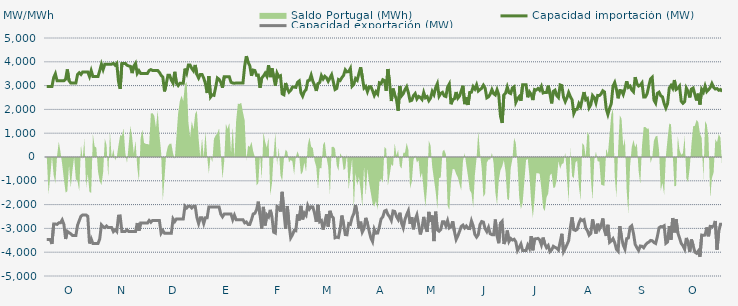
| Category | Capacidad importación (MW) | Capacidad exportación (MW) |
|---|---|---|
| 0 | 2966.667 | -3466.667 |
| 1900-01-01 | 2966.667 | -3466.667 |
| 1900-01-02 | 2966.667 | -3466.667 |
| 1900-01-03 | 2966.667 | -3654.167 |
| 1900-01-04 | 3335.417 | -2816.667 |
| 1900-01-05 | 3495.833 | -2816.667 |
| 1900-01-06 | 3204.167 | -2833.333 |
| 1900-01-07 | 3204.167 | -2766.667 |
| 1900-01-08 | 3204.167 | -2766.667 |
| 1900-01-09 | 3204.167 | -2641.667 |
| 1900-01-10 | 3204.167 | -2833.333 |
| 1900-01-11 | 3266.667 | -3443.75 |
| 1900-01-12 | 3679.167 | -3122.917 |
| 1900-01-13 | 3208.333 | -3179.167 |
| 1900-01-14 | 3108.333 | -3225 |
| 1900-01-15 | 3108.333 | -3300 |
| 1900-01-16 | 3108.333 | -3300 |
| 1900-01-17 | 3108.333 | -3300 |
| 1900-01-18 | 3466.667 | -2866.667 |
| 1900-01-19 | 3541.667 | -2672.5 |
| 1900-01-20 | 3466.667 | -2487.5 |
| 1900-01-21 | 3570.833 | -2433.333 |
| 1900-01-22 | 3570.833 | -2433.333 |
| 1900-01-23 | 3570.833 | -2433.333 |
| 1900-01-24 | 3570.833 | -2491.667 |
| 1900-01-25 | 3383.333 | -3633.333 |
| 1900-01-26 | 3632 | -3440 |
| 1900-01-27 | 3383.333 | -3633.333 |
| 1900-01-28 | 3383.333 | -3633.333 |
| 1900-01-29 | 3383.333 | -3633.333 |
| 1900-01-30 | 3383.333 | -3633.333 |
| 1900-01-31 | 3625 | -3445.833 |
| 1900-02-01 | 3900 | -2849.25 |
| 1900-02-02 | 3675 | -2929.167 |
| 1900-02-03 | 3900 | -2966.667 |
| 1900-02-04 | 3900 | -2900 |
| 1900-02-05 | 3900 | -2966.667 |
| 1900-02-06 | 3900 | -2966.667 |
| 1900-02-07 | 3900 | -2966.667 |
| 1900-02-08 | 3933.333 | -3133.333 |
| 1900-02-09 | 3858.333 | -3058.333 |
| 1900-02-10 | 3933.333 | -3133.333 |
| 1900-02-11 | 3175 | -2483.333 |
| 1900-02-12 | 2862.5 | -2475 |
| 1900-02-13 | 3933.333 | -3133.333 |
| 1900-02-14 | 3933.333 | -3133.333 |
| 1900-02-15 | 3933.333 | -3133.333 |
| 1900-02-16 | 3858.333 | -3058.333 |
| 1900-02-17 | 3825 | -3133.333 |
| 1900-02-18 | 3808.333 | -3133.333 |
| 1900-02-19 | 3525 | -3133.333 |
| 1900-02-20 | 3816.708 | -3133.333 |
| 1900-02-21 | 3933.333 | -3133.333 |
| 1900-02-22 | 3512.5 | -2775 |
| 1900-02-23 | 3627.083 | -3095.833 |
| 1900-02-24 | 3512.5 | -2775 |
| 1900-02-25 | 3512.5 | -2775 |
| 1900-02-26 | 3512.5 | -2775 |
| 1900-02-27 | 3512.5 | -2775 |
| 1900-02-28 | 3512.5 | -2775 |
| 1900-02-28 | 3633.333 | -2666.667 |
| 1900-03-01 | 3670.833 | -2741.667 |
| 1900-03-02 | 3633.333 | -2666.667 |
| 1900-03-03 | 3633.333 | -2666.667 |
| 1900-03-04 | 3633.333 | -2666.667 |
| 1900-03-05 | 3633.333 | -2666.667 |
| 1900-03-06 | 3557.083 | -2666.667 |
| 1900-03-07 | 3433.333 | -3200 |
| 1900-03-08 | 3358.333 | -3087.5 |
| 1900-03-09 | 2756.25 | -3200 |
| 1900-03-10 | 3066.667 | -3200 |
| 1900-03-11 | 3433.333 | -3200 |
| 1900-03-12 | 3433.333 | -3200 |
| 1900-03-13 | 3232.417 | -3200 |
| 1900-03-14 | 3100 | -2600 |
| 1900-03-15 | 3579.167 | -2712.5 |
| 1900-03-16 | 3100 | -2600 |
| 1900-03-17 | 3000.75 | -2600 |
| 1900-03-18 | 3100 | -2600 |
| 1900-03-19 | 3100 | -2600 |
| 1900-03-20 | 3100 | -2600 |
| 1900-03-21 | 3712.917 | -2066.667 |
| 1900-03-22 | 3527.083 | -2141.667 |
| 1900-03-23 | 3866.667 | -2066.667 |
| 1900-03-24 | 3866.667 | -2066.667 |
| 1900-03-25 | 3716.667 | -2141.667 |
| 1900-03-26 | 3616.667 | -2066.667 |
| 1900-03-27 | 3866.667 | -2066.667 |
| 1900-03-28 | 3466.667 | -2550 |
| 1900-03-29 | 3316.667 | -2795.833 |
| 1900-03-30 | 3466.667 | -2550 |
| 1900-03-31 | 3466.667 | -2550 |
| 1900-04-01 | 3316.667 | -2795.833 |
| 1900-04-02 | 3082.167 | -2550 |
| 1900-04-03 | 2687.5 | -2550 |
| 1900-04-04 | 3400 | -2100 |
| 1900-04-05 | 2520.833 | -2100 |
| 1900-04-06 | 2614.583 | -2100 |
| 1900-04-07 | 2591.25 | -2100 |
| 1900-04-08 | 2932.083 | -2100 |
| 1900-04-09 | 3318.75 | -2100 |
| 1900-04-10 | 3262.5 | -2100 |
| 1900-04-11 | 3139.583 | -2400 |
| 1900-04-12 | 2912.5 | -2512.5 |
| 1900-04-13 | 3366.667 | -2400 |
| 1900-04-14 | 3366.667 | -2400 |
| 1900-04-15 | 3366.667 | -2400 |
| 1900-04-16 | 3366.667 | -2400 |
| 1900-04-17 | 3139.583 | -2400 |
| 1900-04-18 | 3108.333 | -2633.333 |
| 1900-04-19 | 3100 | -2445.833 |
| 1900-04-20 | 3108.333 | -2633.333 |
| 1900-04-21 | 3108.333 | -2633.333 |
| 1900-04-22 | 3108.333 | -2633.333 |
| 1900-04-23 | 3108.333 | -2633.333 |
| 1900-04-24 | 3108.333 | -2633.333 |
| 1900-04-25 | 3822.917 | -2766.667 |
| 1900-04-26 | 4239.583 | -2729.167 |
| 1900-04-27 | 3979.167 | -2833.333 |
| 1900-04-28 | 3841.667 | -2833.333 |
| 1900-04-29 | 3414.375 | -2634.375 |
| 1900-04-30 | 3652.5 | -2392.5 |
| 1900-05-01 | 3633.75 | -2364.375 |
| 1900-05-02 | 3431.25 | -2212.5 |
| 1900-05-03 | 3442.5 | -1876.875 |
| 1900-05-04 | 2908.125 | -2420.625 |
| 1900-05-05 | 3318.75 | -3009.375 |
| 1900-05-06 | 3401.25 | -2096.25 |
| 1900-05-07 | 3519.375 | -2876.25 |
| 1900-05-08 | 3392.5 | -2430 |
| 1900-05-09 | 3856.875 | -2512.5 |
| 1900-05-10 | 3356.25 | -2221.875 |
| 1900-05-11 | 3727.5 | -2516.25 |
| 1900-05-12 | 3372.5 | -3157.5 |
| 1900-05-13 | 3000.208 | -3195 |
| 1900-05-14 | 3522.083 | -2079.375 |
| 1900-05-15 | 3371.667 | -2122.5 |
| 1900-05-16 | 3412.5 | -2291.25 |
| 1900-05-17 | 2653.125 | -1464.375 |
| 1900-05-18 | 2615 | -2298.75 |
| 1900-05-19 | 3110.625 | -3018.75 |
| 1900-05-20 | 2861.792 | -2062.5 |
| 1900-05-21 | 2726.042 | -2823.75 |
| 1900-05-22 | 2799.583 | -3397.5 |
| 1900-05-23 | 2936.25 | -3273.75 |
| 1900-05-24 | 2938.125 | -3091.875 |
| 1900-05-25 | 2925 | -3101.25 |
| 1900-05-26 | 3136.875 | -2413.125 |
| 1900-05-27 | 3195.208 | -2666.25 |
| 1900-05-28 | 2702.083 | -2053.125 |
| 1900-05-29 | 2556.042 | -2621.25 |
| 1900-05-30 | 2748.75 | -2355 |
| 1900-05-31 | 2825.625 | -2448.75 |
| 1900-06-01 | 3204.375 | -2034.375 |
| 1900-06-02 | 3223.333 | -2188.125 |
| 1900-06-03 | 3440.625 | -2092.5 |
| 1900-06-04 | 3180 | -2100 |
| 1900-06-05 | 3016.875 | -2368.125 |
| 1900-06-06 | 2777.292 | -2722.5 |
| 1900-06-07 | 3084.375 | -2008.125 |
| 1900-06-08 | 3130.833 | -2720.625 |
| 1900-06-09 | 3418.75 | -2671.875 |
| 1900-06-10 | 3277.917 | -3046.875 |
| 1900-06-11 | 3390.833 | -2735.625 |
| 1900-06-12 | 3326.25 | -2407.5 |
| 1900-06-13 | 3180 | -2921.25 |
| 1900-06-14 | 3320.625 | -2262.708 |
| 1900-06-15 | 3457.5 | -2488.125 |
| 1900-06-16 | 3158.75 | -2557.5 |
| 1900-06-17 | 2836.25 | -3393.75 |
| 1900-06-18 | 2879.167 | -3365.625 |
| 1900-06-19 | 3254.167 | -3384.375 |
| 1900-06-20 | 3214.167 | -3018.75 |
| 1900-06-21 | 3335.625 | -2460 |
| 1900-06-22 | 3429.375 | -2818.125 |
| 1900-06-23 | 3663.75 | -3258.75 |
| 1900-06-24 | 3577.583 | -3268.125 |
| 1900-06-25 | 3586.875 | -2801.25 |
| 1900-06-26 | 3721.875 | -2831.25 |
| 1900-06-27 | 2977.5 | -2542.5 |
| 1900-06-28 | 3058.043 | -2379.13 |
| 1900-06-29 | 3294.375 | -2013.75 |
| 1900-06-30 | 3223.125 | -2388.75 |
| 1900-07-01 | 3506.25 | -3005.625 |
| 1900-07-02 | 3770.625 | -2718.75 |
| 1900-07-03 | 3346.875 | -3153.75 |
| 1900-07-04 | 2898.75 | -3009.375 |
| 1900-07-05 | 2966.25 | -2556.708 |
| 1900-07-06 | 2745.417 | -2786.25 |
| 1900-07-07 | 2951.25 | -3112.083 |
| 1900-07-08 | 2955 | -3401.25 |
| 1900-07-09 | 2788.125 | -3553.125 |
| 1900-07-10 | 2587.5 | -3033.75 |
| 1900-07-11 | 2745 | -3200.625 |
| 1900-07-12 | 2645.625 | -3195 |
| 1900-07-13 | 3116.25 | -2932.5 |
| 1900-07-14 | 3084.375 | -2598.75 |
| 1900-07-15 | 3247.5 | -2520 |
| 1900-07-16 | 3208.125 | -2272.5 |
| 1900-07-17 | 2782.708 | -2238.75 |
| 1900-07-18 | 3697.5 | -2418.75 |
| 1900-07-19 | 3103.125 | -2514.375 |
| 1900-07-20 | 2351.667 | -2662.5 |
| 1900-07-21 | 2876.25 | -2268.75 |
| 1900-07-22 | 2613.75 | -2287.5 |
| 1900-07-23 | 2422.5 | -2499.375 |
| 1900-07-24 | 1945.5 | -2625 |
| 1900-07-25 | 2981.25 | -2341.875 |
| 1900-07-26 | 2567.917 | -2775 |
| 1900-07-27 | 2658.542 | -2977.5 |
| 1900-07-28 | 2829.375 | -2626.875 |
| 1900-07-29 | 2951.25 | -2420.625 |
| 1900-07-30 | 2701.875 | -2257.5 |
| 1900-07-31 | 2356.875 | -2804.792 |
| 1900-08-01 | 2381.875 | -2527.5 |
| 1900-08-02 | 2578.125 | -3035.625 |
| 1900-08-03 | 2666.25 | -2621.042 |
| 1900-08-04 | 2439.583 | -2431.875 |
| 1900-08-05 | 2546.667 | -2835 |
| 1900-08-06 | 2503.125 | -3253.125 |
| 1900-08-07 | 2418.75 | -2985 |
| 1900-08-08 | 2711.25 | -2516.25 |
| 1900-08-09 | 2490 | -2932.5 |
| 1900-08-10 | 2538.75 | -3144.375 |
| 1900-08-11 | 2367.708 | -2306.25 |
| 1900-08-12 | 2476.875 | -2730 |
| 1900-08-13 | 2754.375 | -2460 |
| 1900-08-14 | 2620.833 | -3533.333 |
| 1900-08-15 | 2916.875 | -2297.5 |
| 1900-08-16 | 3082.5 | -3063.75 |
| 1900-08-17 | 2553.75 | -3120 |
| 1900-08-18 | 2671.875 | -3043.125 |
| 1900-08-19 | 2716.875 | -2722.5 |
| 1900-08-20 | 2568.75 | -2724.375 |
| 1900-08-21 | 2540.625 | -2896.875 |
| 1900-08-22 | 2938.125 | -2677.5 |
| 1900-08-23 | 3066.667 | -2979.167 |
| 1900-08-24 | 2218.125 | -2926.875 |
| 1900-08-25 | 2411.25 | -2701.875 |
| 1900-08-26 | 2443.125 | -3125.625 |
| 1900-08-27 | 2729.167 | -3466.667 |
| 1900-08-28 | 2471.25 | -3315 |
| 1900-08-29 | 2561.875 | -3127.375 |
| 1900-08-30 | 2778.75 | -2917.5 |
| 1900-08-31 | 2992.5 | -2861.25 |
| 1900-09-01 | 2221.875 | -2981.25 |
| 1900-09-02 | 2505 | -2900.625 |
| 1900-09-03 | 2187.5 | -3000 |
| 1900-09-04 | 2711.75 | -3007.5 |
| 1900-09-05 | 2723.125 | -2684.417 |
| 1900-09-06 | 2956.125 | -2899.25 |
| 1900-09-07 | 2855.625 | -3256.875 |
| 1900-09-08 | 3033.333 | -3366.667 |
| 1900-09-09 | 2771.25 | -3262.5 |
| 1900-09-10 | 2832.375 | -2842.5 |
| 1900-09-11 | 2887.5 | -2711.042 |
| 1900-09-12 | 3015 | -2735.625 |
| 1900-09-13 | 2893.125 | -3015 |
| 1900-09-14 | 2486.25 | -3135 |
| 1900-09-15 | 2529.375 | -2958.75 |
| 1900-09-16 | 2643.75 | -3226.875 |
| 1900-09-17 | 2831.667 | -3261.75 |
| 1900-09-18 | 2662.25 | -3262.25 |
| 1900-09-19 | 2606.25 | -2627.792 |
| 1900-09-20 | 2823.75 | -3316.875 |
| 1900-09-21 | 2608.125 | -3622.5 |
| 1900-09-22 | 1721.458 | -2778.75 |
| 1900-09-23 | 1429.792 | -2700 |
| 1900-09-24 | 2611.875 | -3654.375 |
| 1900-09-25 | 2683.125 | -3478.125 |
| 1900-09-26 | 2941.875 | -3088.125 |
| 1900-09-27 | 2701.042 | -3549.167 |
| 1900-09-28 | 2664.375 | -3423.75 |
| 1900-09-29 | 2900.625 | -3487.5 |
| 1900-09-30 | 2951.25 | -3455.625 |
| 1900-10-01 | 2295 | -3562.5 |
| 1900-10-02 | 2445 | -3930 |
| 1900-10-03 | 2535 | -3798.75 |
| 1900-10-04 | 2364.375 | -3654.375 |
| 1900-10-05 | 3033.333 | -3933.333 |
| 1900-10-06 | 3033.333 | -3933.333 |
| 1900-10-07 | 3033.333 | -3933.333 |
| 1900-10-08 | 2508.75 | -3703.125 |
| 1900-10-09 | 2735.625 | -3838.125 |
| 1900-10-10 | 2628.75 | -3326.25 |
| 1900-10-11 | 2392.5 | -3918.75 |
| 1900-10-12 | 2835 | -3440.625 |
| 1900-10-13 | 2812.5 | -3438.75 |
| 1900-10-14 | 2880 | -3420 |
| 1900-10-15 | 2803.125 | -3481.875 |
| 1900-10-16 | 2964.375 | -3691.875 |
| 1900-10-17 | 2690.625 | -3386.25 |
| 1900-10-18 | 2715 | -3656.25 |
| 1900-10-19 | 2711.25 | -3804.375 |
| 1900-10-20 | 2998.125 | -3720 |
| 1900-10-21 | 2660.625 | -3978.75 |
| 1900-10-22 | 2253.75 | -3907.5 |
| 1900-10-23 | 2760 | -3751.875 |
| 1900-10-24 | 2808.75 | -3796.875 |
| 1900-10-25 | 2580 | -3828.75 |
| 1900-10-26 | 2499.375 | -3907.5 |
| 1900-10-27 | 3028.125 | -3577.5 |
| 1900-10-28 | 3001.875 | -3226.875 |
| 1900-10-29 | 2511.25 | -3976.875 |
| 1900-10-30 | 2326.875 | -3840 |
| 1900-10-31 | 2491.875 | -3684.375 |
| 1900-11-01 | 2710.208 | -3515.417 |
| 1900-11-02 | 2535 | -2956.875 |
| 1900-11-03 | 2401.875 | -2535 |
| 1900-11-04 | 1831.875 | -3056.25 |
| 1900-11-05 | 1995 | -3086.25 |
| 1900-11-06 | 2006.875 | -3037.5 |
| 1900-11-07 | 2244.375 | -2777.5 |
| 1900-11-08 | 2118.75 | -2619.375 |
| 1900-11-09 | 2437.5 | -2673.75 |
| 1900-11-10 | 2728.125 | -2634.375 |
| 1900-11-11 | 2403.75 | -2986.875 |
| 1900-11-12 | 2454.375 | -3099.375 |
| 1900-11-13 | 2071.875 | -3285 |
| 1900-11-14 | 2201.125 | -3208.125 |
| 1900-11-15 | 2582.958 | -2621.458 |
| 1900-11-16 | 2493.625 | -2943.125 |
| 1900-11-17 | 2270.5 | -3218.75 |
| 1900-11-18 | 2587.5 | -2803.125 |
| 1900-11-19 | 2581.875 | -3030 |
| 1900-11-20 | 2651.25 | -2895 |
| 1900-11-21 | 2784.375 | -2583.75 |
| 1900-11-22 | 2733.75 | -3084.375 |
| 1900-11-23 | 2030.625 | -3314.375 |
| 1900-11-24 | 1787.25 | -2849.375 |
| 1900-11-25 | 2040.625 | -3583.667 |
| 1900-11-26 | 2251.875 | -3525 |
| 1900-11-27 | 2977.5 | -3429.375 |
| 1900-11-28 | 3129.375 | -3594.583 |
| 1900-11-29 | 2844.375 | -3877.5 |
| 1900-11-30 | 2467.5 | -3956.25 |
| 1900-12-01 | 2793.75 | -2904.375 |
| 1900-12-02 | 2786.25 | -3382.5 |
| 1900-12-03 | 2626.875 | -3703.125 |
| 1900-12-04 | 2870.625 | -3871.875 |
| 1900-12-05 | 3183.75 | -3431.25 |
| 1900-12-06 | 2926.875 | -3403.125 |
| 1900-12-07 | 2979.375 | -2951.25 |
| 1900-12-08 | 2814.375 | -2887.5 |
| 1900-12-09 | 2737.5 | -3208.125 |
| 1900-12-10 | 3352.5 | -3671.25 |
| 1900-12-11 | 3078.75 | -3808.125 |
| 1900-12-12 | 2983.125 | -3926.25 |
| 1900-12-13 | 3018.75 | -3738.75 |
| 1900-12-14 | 3114.375 | -3751.875 |
| 1900-12-15 | 2520 | -3813.75 |
| 1900-12-16 | 2523.75 | -3697.292 |
| 1900-12-17 | 2658.542 | -3615 |
| 1900-12-18 | 2986.875 | -3575.625 |
| 1900-12-19 | 3273.625 | -3505.833 |
| 1900-12-20 | 3348.75 | -3519.375 |
| 1900-12-21 | 2390.625 | -3592.5 |
| 1900-12-22 | 2265 | -3631.875 |
| 1900-12-23 | 2675.625 | -3346.875 |
| 1900-12-24 | 2724.375 | -2973.75 |
| 1900-12-25 | 2571.875 | -2923.125 |
| 1900-12-26 | 2527.5 | -2930.042 |
| 1900-12-27 | 2244.375 | -2888.708 |
| 1900-12-28 | 2059.333 | -3626.25 |
| 1900-12-29 | 2244.375 | -3570 |
| 1900-12-30 | 2900 | -2900 |
| 1900-12-31 | 3007.5 | -3476.25 |
| 1901-01-01 | 2885.625 | -2562.917 |
| 1901-01-02 | 3233.333 | -3166.667 |
| 1901-01-03 | 2836.875 | -2610.208 |
| 1901-01-04 | 2889.375 | -3189.375 |
| 1901-01-05 | 2979.375 | -3399.375 |
| 1901-01-06 | 2345.625 | -3628.125 |
| 1901-01-07 | 2257.5 | -3725.625 |
| 1901-01-08 | 2323.125 | -3871.875 |
| 1901-01-09 | 2895 | -3401.25 |
| 1901-01-10 | 2760 | -3600 |
| 1901-01-11 | 2503.125 | -3987.75 |
| 1901-01-12 | 2855.625 | -3466.875 |
| 1901-01-13 | 2898.75 | -3720 |
| 1901-01-14 | 2628.75 | -3997.5 |
| 1901-01-15 | 2375.625 | -4044.375 |
| 1901-01-16 | 2660.625 | -3947.875 |
| 1901-01-17 | 2205 | -4190.625 |
| 1901-01-18 | 2840.625 | -3281.25 |
| 1901-01-19 | 2726.25 | -3292.5 |
| 1901-01-20 | 2983.125 | -3279.375 |
| 1901-01-21 | 2750.625 | -2960.625 |
| 1901-01-22 | 2827.5 | -3330 |
| 1901-01-23 | 2917.5 | -2915.625 |
| 1901-01-24 | 3087 | -2927.6 |
| 1901-01-25 | 2928.75 | -2903.792 |
| 1901-01-26 | 2857.5 | -2686.875 |
| 1901-01-27 | 2874.375 | -3894.375 |
| 1901-01-28 | 2803.125 | -3136.875 |
| 1901-01-29 | 2836.875 | -2825.625 |
| 1901-01-30 | 2752.5 | -2825.625 |